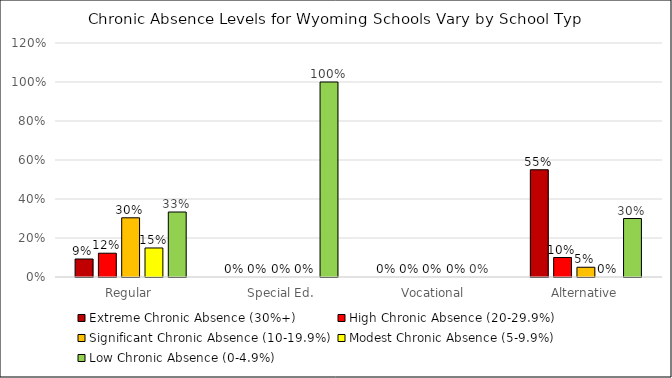
| Category | Extreme Chronic Absence (30%+) | High Chronic Absence (20-29.9%) | Significant Chronic Absence (10-19.9%) | Modest Chronic Absence (5-9.9%) | Low Chronic Absence (0-4.9%) |
|---|---|---|---|---|---|
| Regular | 0.092 | 0.122 | 0.304 | 0.149 | 0.333 |
| Special Ed. | 0 | 0 | 0 | 0 | 1 |
| Vocational | 0 | 0 | 0 | 0 | 0 |
| Alternative | 0.55 | 0.1 | 0.05 | 0 | 0.3 |